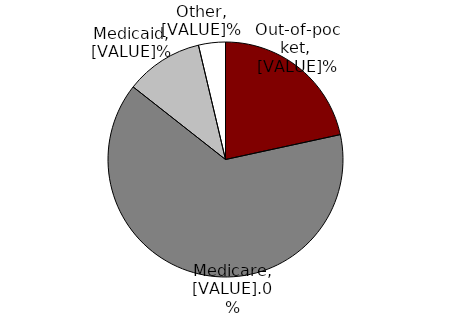
| Category | Series 0 |
|---|---|
| Out-of-pocket | 21.6 |
| Medicare | 64 |
| Medicaid | 10.7 |
| Other | 3.7 |